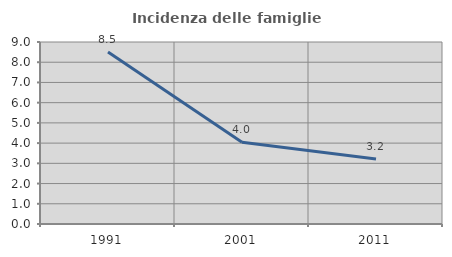
| Category | Incidenza delle famiglie numerose |
|---|---|
| 1991.0 | 8.501 |
| 2001.0 | 4.048 |
| 2011.0 | 3.215 |